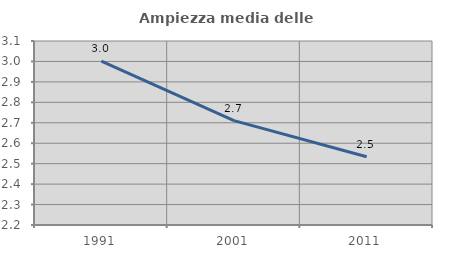
| Category | Ampiezza media delle famiglie |
|---|---|
| 1991.0 | 3.002 |
| 2001.0 | 2.711 |
| 2011.0 | 2.534 |